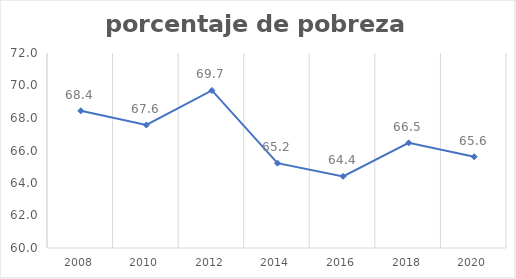
| Category | Series 0 |
|---|---|
| 2008.0 | 68.443 |
| 2010.0 | 67.571 |
| 2012.0 | 69.696 |
| 2014.0 | 65.218 |
| 2016.0 | 64.407 |
| 2018.0 | 66.469 |
| 2020.0 | 65.617 |